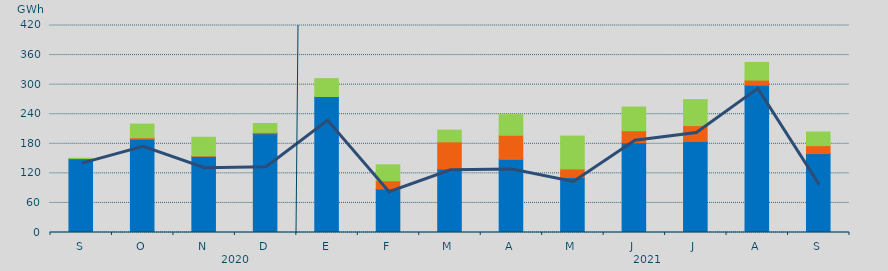
| Category | Asignación SEPE | Asignación Francia | Asignación Portugal |
|---|---|---|---|
| S | 149824 | 0 | 875 |
| O | 189238.4 | 3056.5 | 27606.6 |
| N | 154473.6 | 1071 | 37654.2 |
| D | 200440 | 2647 | 18165 |
| E | 275840.2 | 0 | 36360.3 |
| F | 88172.2 | 16686.7 | 32453.2 |
| M | 128766.4 | 55171.8 | 23771 |
| A | 148371.2 | 48949.5 | 41786.5 |
| M | 111851.8 | 17155.7 | 66602 |
| J | 182049.8 | 24417.4 | 48121.8 |
| J | 184550.8 | 32356.7 | 52628.6 |
| A | 298829.9 | 10422.8 | 35868.4 |
| S | 160066 | 16160 | 27614.8 |